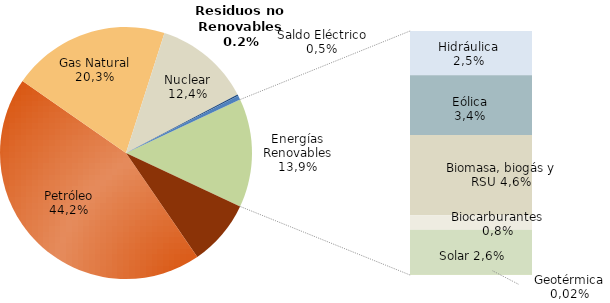
| Category | Series 0 |
|---|---|
| Carbón | 10442.042 |
| Petróleo | 54632.766 |
| Gas Natural | 25035.279 |
| Nuclear | 15260.264 |
| Residuos no Renovables | 242.581 |
| Saldo Eléctrico | 659.264 |
| Hidráulica | 3129.134 |
| Eólica | 4206.604 |
| Biomasa, biogás y RSU | 5661.699 |
| Biocarburantes | 1022.799 |
| Solar | 3177.236 |
| Geotérmica | 19.423 |